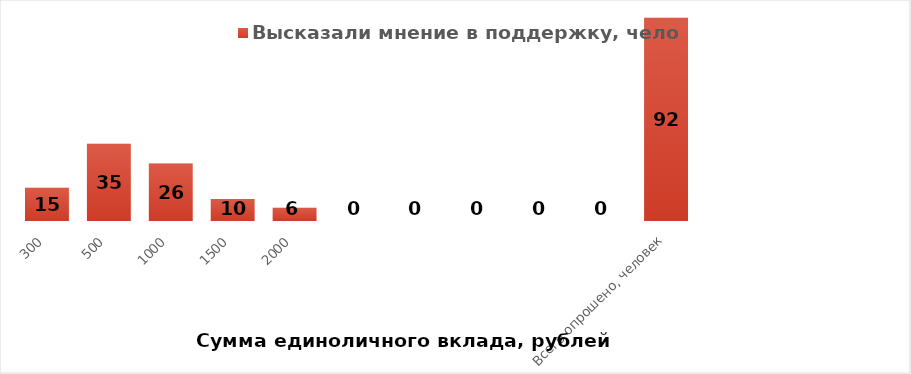
| Category | Высказали мнение в поддержку, человек |
|---|---|
| 300 | 15 |
| 500 | 35 |
| 1000 | 26 |
| 1500 | 10 |
| 2000 | 6 |
|  | 0 |
|  | 0 |
|  | 0 |
|  | 0 |
|  | 0 |
| Всего опрошено, человек | 92 |